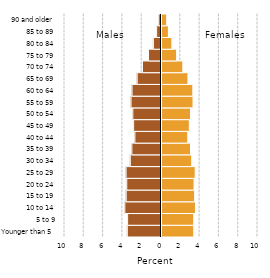
| Category | Female |
|---|---|
| Younger than 5 | 3.339 |
| 5 to 9 | 3.342 |
| 10 to 14 | 3.52 |
| 15 to 19 | 3.433 |
| 20 to 24 | 3.372 |
| 25 to 29 | 3.491 |
| 30 to 34 | 3.134 |
| 35 to 39 | 3.005 |
| 40 to 44 | 2.723 |
| 45 to 49 | 2.882 |
| 50 to 54 | 3.006 |
| 55 to 59 | 3.267 |
| 60 to 64 | 3.247 |
| 65 to 69 | 2.743 |
| 70 to 74 | 2.21 |
| 75 to 79 | 1.567 |
| 80 to 84 | 1.074 |
| 85 to 89 | 0.715 |
| 90 and older | 0.537 |